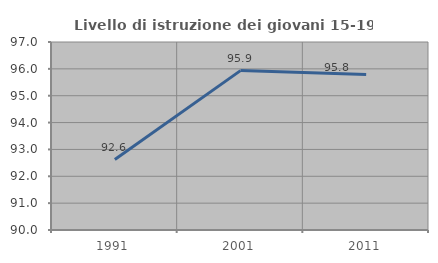
| Category | Livello di istruzione dei giovani 15-19 anni |
|---|---|
| 1991.0 | 92.623 |
| 2001.0 | 95.935 |
| 2011.0 | 95.789 |